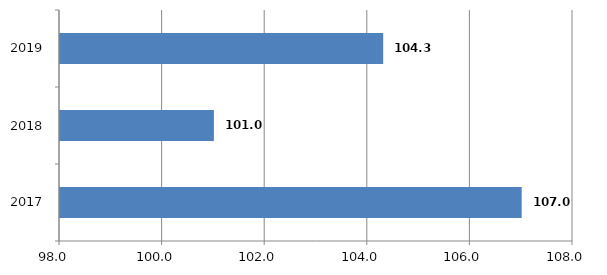
| Category | Series 0 |
|---|---|
| 2017.0 | 107 |
| 2018.0 | 101 |
| 2019.0 | 104.3 |